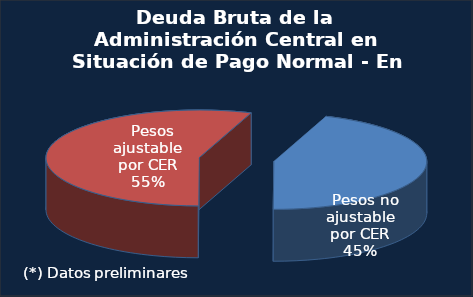
| Category | Series 0 |
|---|---|
|   Pesos no ajustable por CER | 35860.9 |
|   Pesos ajustable por CER | 44702.6 |